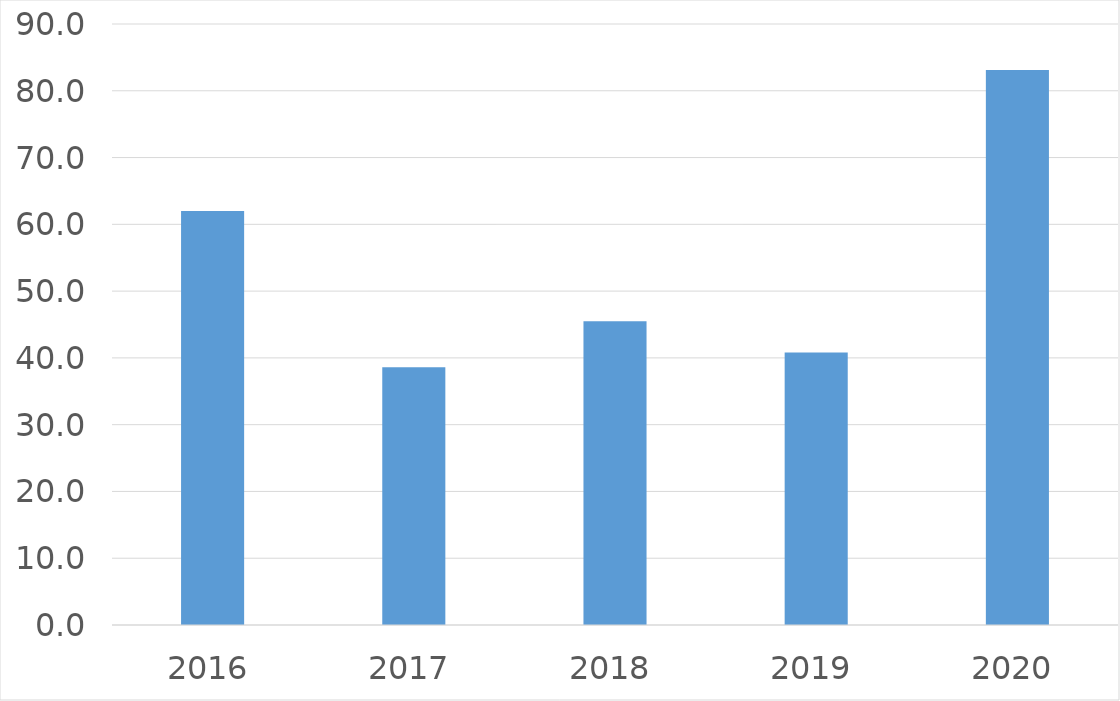
| Category | Series 0 |
|---|---|
| 2016 | 62 |
| 2017 | 38.6 |
| 2018 | 45.5 |
| 2019 | 40.8 |
| 2020 | 83.1 |